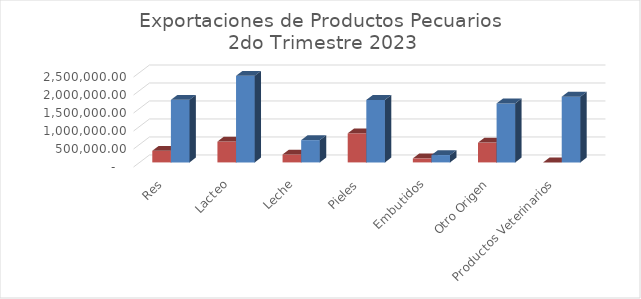
| Category | Kilos | Valor US$ |
|---|---|---|
| Res | 323560.16 | 1738369.19 |
| Lacteo | 579985.47 | 2406304.49 |
| Leche | 220779.41 | 619571.63 |
| Pieles | 808727.5 | 1736856.96 |
| Embutidos | 112292.83 | 204055.5 |
| Otro Origen | 549975.66 | 1640080.69 |
| Productos Veterinarios | 0 | 1826399.34 |